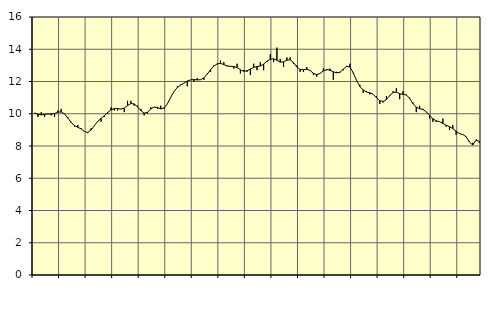
| Category | Piggar | Series 1 |
|---|---|---|
| nan | 10 | 10.05 |
| 87.0 | 9.8 | 9.97 |
| 87.0 | 10.1 | 9.93 |
| 87.0 | 9.8 | 9.96 |
| nan | 10 | 9.99 |
| 88.0 | 9.9 | 9.98 |
| 88.0 | 9.8 | 10.01 |
| 88.0 | 10.2 | 10.1 |
| nan | 10.3 | 10.11 |
| 89.0 | 10 | 9.99 |
| 89.0 | 9.8 | 9.73 |
| 89.0 | 9.5 | 9.46 |
| nan | 9.2 | 9.27 |
| 90.0 | 9.3 | 9.16 |
| 90.0 | 9.1 | 9.06 |
| 90.0 | 8.9 | 8.9 |
| nan | 8.8 | 8.84 |
| 91.0 | 9.1 | 8.99 |
| 91.0 | 9.3 | 9.26 |
| 91.0 | 9.5 | 9.53 |
| nan | 9.5 | 9.71 |
| 92.0 | 9.8 | 9.88 |
| 92.0 | 10 | 10.08 |
| 92.0 | 10.4 | 10.24 |
| nan | 10.2 | 10.32 |
| 93.0 | 10.2 | 10.32 |
| 93.0 | 10.3 | 10.29 |
| 93.0 | 10.1 | 10.35 |
| nan | 10.8 | 10.51 |
| 94.0 | 10.8 | 10.63 |
| 94.0 | 10.5 | 10.61 |
| 94.0 | 10.5 | 10.43 |
| nan | 10.3 | 10.2 |
| 95.0 | 9.9 | 10.04 |
| 95.0 | 10 | 10.09 |
| 95.0 | 10.4 | 10.3 |
| nan | 10.4 | 10.42 |
| 96.0 | 10.3 | 10.39 |
| 96.0 | 10.5 | 10.3 |
| 96.0 | 10.3 | 10.36 |
| nan | 10.6 | 10.62 |
| 97.0 | 11 | 11.02 |
| 97.0 | 11.4 | 11.39 |
| 97.0 | 11.7 | 11.63 |
| nan | 11.8 | 11.78 |
| 98.0 | 11.9 | 11.9 |
| 98.0 | 11.7 | 12.03 |
| 98.0 | 12.1 | 12.1 |
| nan | 12 | 12.12 |
| 99.0 | 12.2 | 12.1 |
| 99.0 | 12.1 | 12.11 |
| 99.0 | 12.1 | 12.23 |
| nan | 12.5 | 12.46 |
| 0.0 | 12.6 | 12.73 |
| 0.0 | 13 | 12.96 |
| 0.0 | 13.1 | 13.09 |
| nan | 13.3 | 13.12 |
| 1.0 | 13.2 | 13.05 |
| 1.0 | 13 | 12.96 |
| 1.0 | 12.9 | 12.94 |
| nan | 12.8 | 12.93 |
| 2.0 | 13.1 | 12.86 |
| 2.0 | 12.5 | 12.73 |
| 2.0 | 12.7 | 12.63 |
| nan | 12.6 | 12.67 |
| 3.0 | 12.4 | 12.77 |
| 3.0 | 13.1 | 12.87 |
| 3.0 | 12.7 | 12.93 |
| nan | 13.2 | 12.96 |
| 4.0 | 12.7 | 13.08 |
| 4.0 | 13.2 | 13.26 |
| 4.0 | 13.7 | 13.38 |
| nan | 13.2 | 13.41 |
| 5.0 | 14.1 | 13.32 |
| 5.0 | 13.4 | 13.2 |
| 5.0 | 12.9 | 13.22 |
| nan | 13.5 | 13.32 |
| 6.0 | 13.5 | 13.35 |
| 6.0 | 13.1 | 13.17 |
| 6.0 | 13 | 12.9 |
| nan | 12.6 | 12.74 |
| 7.0 | 12.6 | 12.73 |
| 7.0 | 12.9 | 12.76 |
| 7.0 | 12.7 | 12.68 |
| nan | 12.4 | 12.51 |
| 8.0 | 12.3 | 12.42 |
| 8.0 | 12.5 | 12.5 |
| 8.0 | 12.8 | 12.66 |
| nan | 12.7 | 12.74 |
| 9.0 | 12.8 | 12.7 |
| 9.0 | 12.1 | 12.6 |
| 9.0 | 12.6 | 12.54 |
| nan | 12.6 | 12.57 |
| 10.0 | 12.7 | 12.76 |
| 10.0 | 12.9 | 12.94 |
| 10.0 | 13.1 | 12.9 |
| nan | 12.5 | 12.54 |
| 11.0 | 12.1 | 12.07 |
| 11.0 | 11.8 | 11.69 |
| 11.0 | 11.3 | 11.47 |
| nan | 11.4 | 11.35 |
| 12.0 | 11.2 | 11.3 |
| 12.0 | 11.2 | 11.21 |
| 12.0 | 11.1 | 10.99 |
| nan | 10.6 | 10.81 |
| 13.0 | 10.7 | 10.76 |
| 13.0 | 11.1 | 10.88 |
| 13.0 | 11.1 | 11.13 |
| nan | 11.4 | 11.32 |
| 14.0 | 11.6 | 11.34 |
| 14.0 | 10.9 | 11.24 |
| 14.0 | 11.4 | 11.2 |
| nan | 11.2 | 11.17 |
| 15.0 | 11 | 10.95 |
| 15.0 | 10.7 | 10.63 |
| 15.0 | 10.1 | 10.41 |
| nan | 10.5 | 10.31 |
| 16.0 | 10.3 | 10.27 |
| 16.0 | 10.1 | 10.12 |
| 16.0 | 9.7 | 9.9 |
| nan | 9.5 | 9.69 |
| 17.0 | 9.5 | 9.56 |
| 17.0 | 9.5 | 9.51 |
| 17.0 | 9.7 | 9.4 |
| nan | 9.2 | 9.29 |
| 18.0 | 9 | 9.2 |
| 18.0 | 9.3 | 9.08 |
| 18.0 | 8.7 | 8.92 |
| nan | 8.8 | 8.77 |
| 19.0 | 8.7 | 8.71 |
| 19.0 | 8.6 | 8.58 |
| 19.0 | 8.3 | 8.25 |
| nan | 8.2 | 8.06 |
| 20.0 | 8.4 | 8.36 |
| 20.0 | 8.2 | 8.29 |